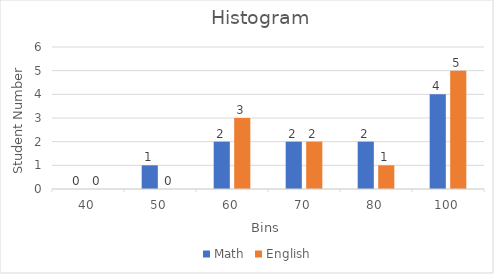
| Category | Math | English |
|---|---|---|
| 40.0 | 0 | 0 |
| 50.0 | 1 | 0 |
| 60.0 | 2 | 3 |
| 70.0 | 2 | 2 |
| 80.0 | 2 | 1 |
| 100.0 | 4 | 5 |